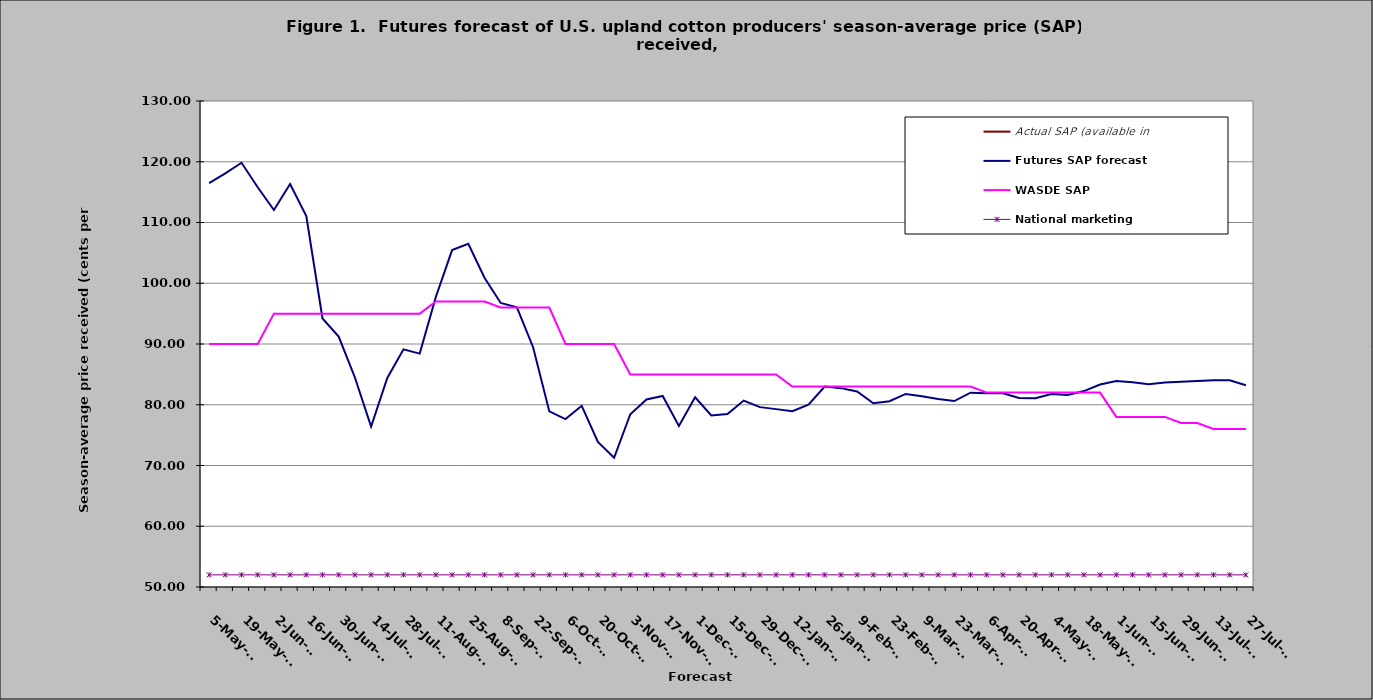
| Category | Actual SAP (available in  | Futures SAP forecast | WASDE SAP | National marketing |
|---|---|---|---|---|
| 2022-05-05 |  | 116.49 | 90 | 52 |
| 2022-05-12 |  | 118.094 | 90 | 52 |
| 2022-05-19 |  | 119.833 | 90 | 52 |
| 2022-05-26 |  | 115.802 | 90 | 52 |
| 2022-06-02 |  | 112.047 | 95 | 52 |
| 2022-06-09 |  | 116.326 | 95 | 52 |
| 2022-06-16 |  | 111.044 | 95 | 52 |
| 2022-06-23 |  | 94.193 | 95 | 52 |
| 2022-06-30 |  | 91.218 | 95 | 52 |
| 2022-07-07 |  | 84.489 | 95 | 52 |
| 2022-07-14 |  | 76.417 | 95 | 52 |
| 2022-07-21 |  | 84.405 | 95 | 52 |
| 2022-07-28 |  | 89.123 | 95 | 52 |
| 2022-08-04 |  | 88.415 | 95 | 52 |
| 2022-08-11 |  | 97.789 | 97 | 52 |
| 2022-08-18 |  | 105.456 | 97 | 52 |
| 2022-08-25 |  | 106.51 | 97 | 52 |
| 2022-09-01 |  | 100.911 | 97 | 52 |
| 2022-09-08 |  | 96.757 | 96 | 52 |
| 2022-09-15 |  | 96.047 | 96 | 52 |
| 2022-09-22 |  | 89.469 | 96 | 52 |
| 2022-09-29 |  | 78.907 | 96 | 52 |
| 2022-10-06 |  | 77.642 | 90 | 52 |
| 2022-10-13 |  | 79.827 | 90 | 52 |
| 2022-10-20 |  | 73.864 | 90 | 52 |
| 2022-10-27 |  | 71.263 | 90 | 52 |
| 2022-11-03 |  | 78.437 | 85 | 52 |
| 2022-11-10 |  | 80.878 | 85 | 52 |
| 2022-11-17 |  | 81.449 | 85 | 52 |
| 2022-11-24 |  | 76.504 | 85 | 52 |
| 2022-12-01 |  | 81.239 | 85 | 52 |
| 2022-12-08 |  | 78.229 | 85 | 52 |
| 2022-12-15 |  | 78.47 | 85 | 52 |
| 2022-12-22 |  | 80.685 | 85 | 52 |
| 2022-12-29 |  | 79.609 | 85 | 52 |
| 2023-01-05 |  | 79.28 | 85 | 52 |
| 2023-01-12 |  | 78.938 | 83 | 52 |
| 2023-01-19 |  | 79.995 | 83 | 52 |
| 2023-01-26 |  | 83.001 | 83 | 52 |
| 2023-02-02 |  | 82.735 | 83 | 52 |
| 2023-02-09 |  | 82.179 | 83 | 52 |
| 2023-02-16 |  | 80.238 | 83 | 52 |
| 2023-02-23 |  | 80.571 | 83 | 52 |
| 2023-03-02 |  | 81.784 | 83 | 52 |
| 2023-03-09 |  | 81.412 | 83 | 52 |
| 2023-03-16 |  | 80.937 | 83 | 52 |
| 2023-03-23 |  | 80.613 | 83 | 52 |
| 2023-03-30 |  | 81.978 | 83 | 52 |
| 2023-04-06 |  | 81.907 | 82 | 52 |
| 2023-04-13 |  | 81.9 | 82 | 52 |
| 2023-04-20 |  | 81.131 | 82 | 52 |
| 2023-04-27 |  | 81.086 | 82 | 52 |
| 2023-05-04 |  | 81.765 | 82 | 52 |
| 2023-05-11 |  | 81.625 | 82 | 52 |
| 2023-05-18 |  | 82.255 | 82 | 52 |
| 2023-05-25 |  | 83.331 | 82 | 52 |
| 2023-06-01 |  | 83.894 | 78 | 52 |
| 2023-06-08 |  | 83.705 | 78 | 52 |
| 2023-06-15 |  | 83.377 | 78 | 52 |
| 2023-06-22 |  | 83.674 | 78 | 52 |
| 2023-06-29 |  | 83.795 | 77 | 52 |
| 2023-07-06 |  | 83.895 | 77 | 52 |
| 2023-07-13 |  | 84.036 | 76 | 52 |
| 2023-07-20 |  | 84.036 | 76 | 52 |
| 2023-07-27 |  | 83.219 | 76 | 52 |